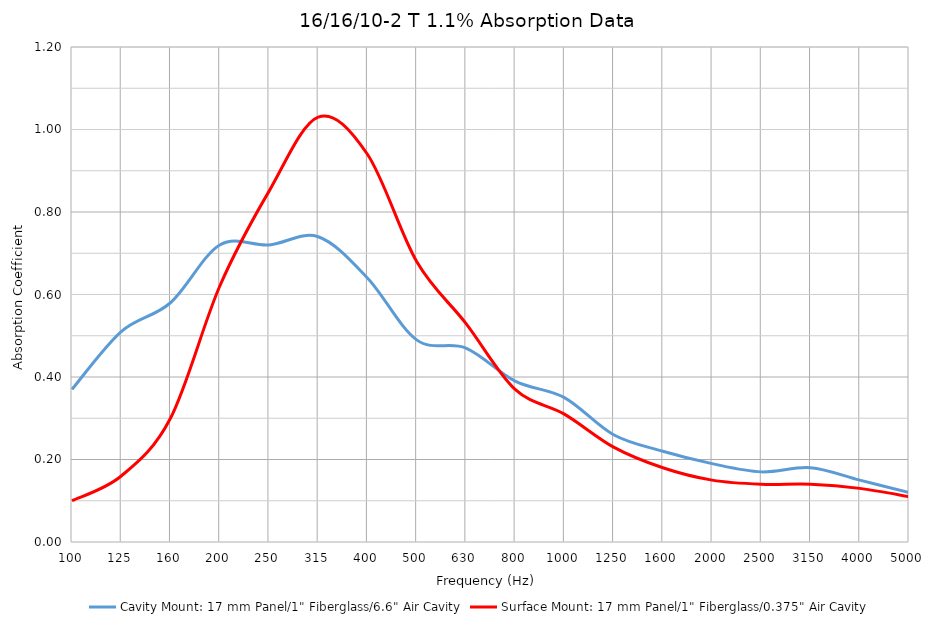
| Category | Cavity Mount: 17 mm Panel/1" Fiberglass/6.6" Air Cavity | Surface Mount: 17 mm Panel/1" Fiberglass/0.375" Air Cavity |
|---|---|---|
| 100.0 | 0.37 | 0.1 |
| 125.0 | 0.51 | 0.16 |
| 160.0 | 0.58 | 0.3 |
| 200.0 | 0.72 | 0.62 |
| 250.0 | 0.72 | 0.85 |
| 315.0 | 0.74 | 1.03 |
| 400.0 | 0.64 | 0.94 |
| 500.0 | 0.49 | 0.68 |
| 630.0 | 0.47 | 0.53 |
| 800.0 | 0.39 | 0.37 |
| 1000.0 | 0.35 | 0.31 |
| 1250.0 | 0.26 | 0.23 |
| 1600.0 | 0.22 | 0.18 |
| 2000.0 | 0.19 | 0.15 |
| 2500.0 | 0.17 | 0.14 |
| 3150.0 | 0.18 | 0.14 |
| 4000.0 | 0.15 | 0.13 |
| 5000.0 | 0.12 | 0.11 |